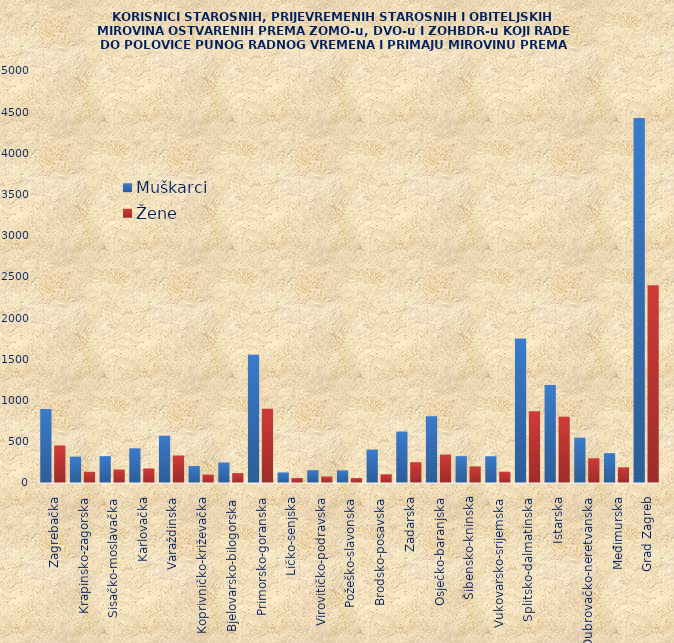
| Category | Muškarci | Žene |
|---|---|---|
| Zagrebačka | 898 | 456 |
| Krapinsko-zagorska | 319 | 136 |
| Sisačko-moslavačka | 326 | 164 |
| Karlovačka | 421 | 177 |
| Varaždinska | 574 | 333 |
| Koprivničko-križevačka | 206 | 101 |
| Bjelovarsko-bilogorska | 248 | 120 |
| Primorsko-goranska | 1555 | 900 |
| Ličko-senjska | 128 | 61 |
| Virovitičko-podravska | 156 | 78 |
| Požeško-slavonska | 153 | 60 |
| Brodsko-posavska | 405 | 105 |
| Zadarska | 625 | 253 |
| Osječko-baranjska | 810 | 344 |
| Šibensko-kninska | 326 | 200 |
| Vukovarsko-srijemska | 325 | 137 |
| Splitsko-dalmatinska | 1754 | 870 |
| Istarska | 1189 | 804 |
| Dubrovačko-neretvanska | 550 | 300 |
| Međimurska | 362 | 190 |
| Grad Zagreb | 4429 | 2401 |